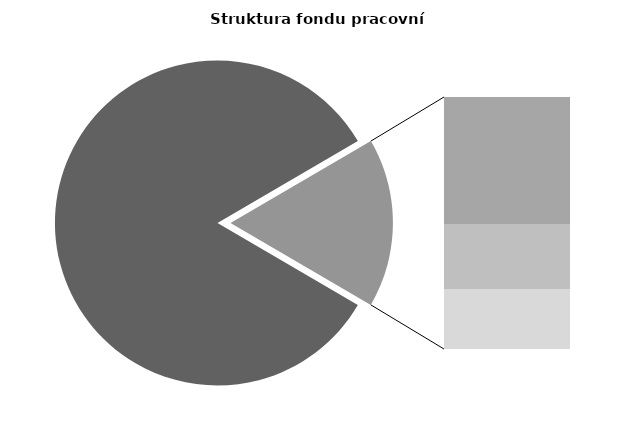
| Category | Series 0 |
|---|---|
| Průměrná měsíční odpracovaná doba bez přesčasu | 141.437 |
| Dovolená | 14.4 |
| Nemoc | 7.371 |
| Jiné | 6.817 |